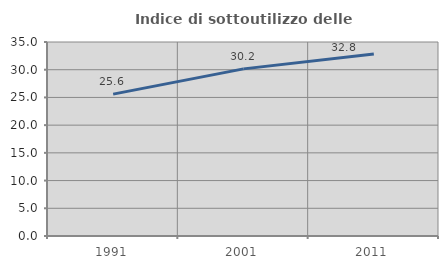
| Category | Indice di sottoutilizzo delle abitazioni  |
|---|---|
| 1991.0 | 25.591 |
| 2001.0 | 30.153 |
| 2011.0 | 32.83 |